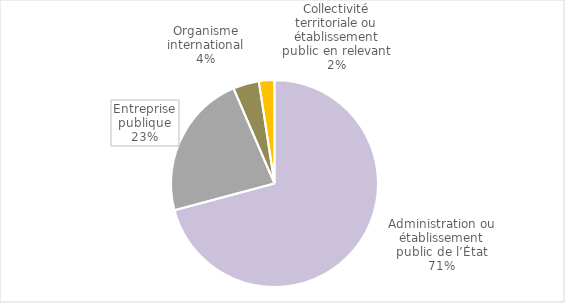
| Category | Series 0 |
|---|---|
| Administration ou établissement public de l’État | 0.709 |
| Entreprise publique | 0.227 |
| Organisme international | 0.04 |
| Collectivité territoriale ou établissement public en relevant | 0.024 |